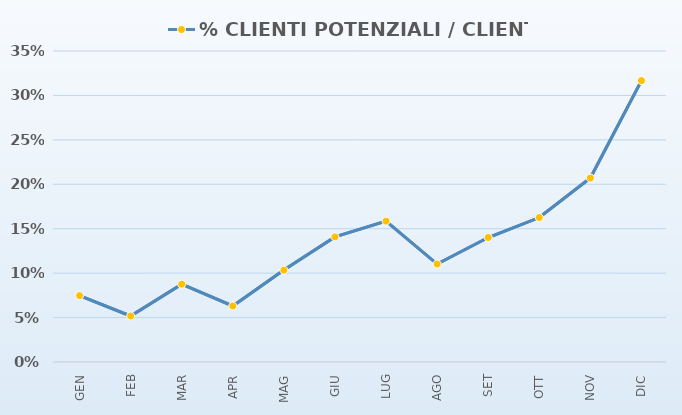
| Category | TASSI DI CONVERSIONE | % CLIENTI POTENZIALI / CLIENTI |
|---|---|---|
| GEN |  | 0.075 |
| FEB |  | 0.052 |
| MAR |  | 0.088 |
| APR |  | 0.063 |
| MAG |  | 0.103 |
| GIU |  | 0.141 |
| LUG |  | 0.159 |
| AGO |  | 0.11 |
| SET |  | 0.14 |
| OTT |  | 0.163 |
| NOV |  | 0.207 |
| DIC |  | 0.317 |